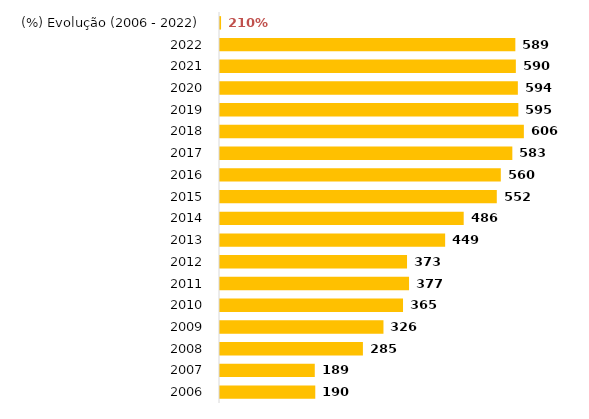
| Category | Total Geral |
|---|---|
| 2006 | 190 |
| 2007 | 189 |
| 2008 | 285 |
| 2009 | 326 |
| 2010 | 365 |
| 2011 | 377 |
| 2012 | 373 |
| 2013 | 449 |
| 2014 | 486 |
| 2015 | 552 |
| 2016 | 560 |
| 2017 | 583 |
| 2018 | 606 |
| 2019 | 595 |
| 2020 | 594 |
| 2021 | 590 |
| 2022 | 589 |
| (%) Evolução (2006 - 2022) | 2.1 |